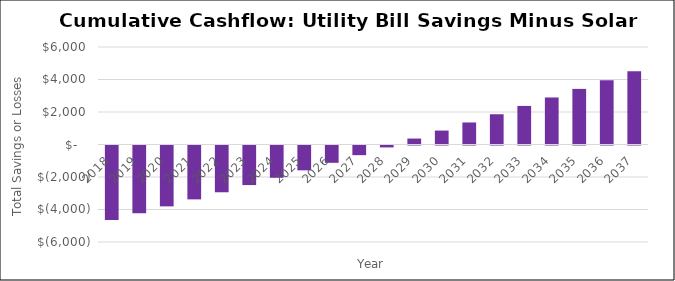
| Category | Series 0 |
|---|---|
| 2018.0 | -4588.053 |
| 2019.0 | -4169.969 |
| 2020.0 | -3745.665 |
| 2021.0 | -3315.062 |
| 2022.0 | -2878.075 |
| 2023.0 | -2434.623 |
| 2024.0 | -1984.622 |
| 2025.0 | -1527.987 |
| 2026.0 | -1064.632 |
| 2027.0 | -594.472 |
| 2028.0 | -117.419 |
| 2029.0 | 366.613 |
| 2030.0 | 857.715 |
| 2031.0 | 1355.973 |
| 2032.0 | 1861.479 |
| 2033.0 | 2374.323 |
| 2034.0 | 2894.597 |
| 2035.0 | 3422.391 |
| 2036.0 | 3957.8 |
| 2037.0 | 4500.916 |